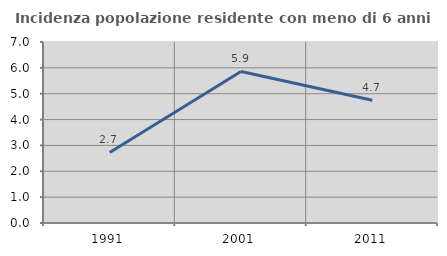
| Category | Incidenza popolazione residente con meno di 6 anni |
|---|---|
| 1991.0 | 2.727 |
| 2001.0 | 5.859 |
| 2011.0 | 4.745 |